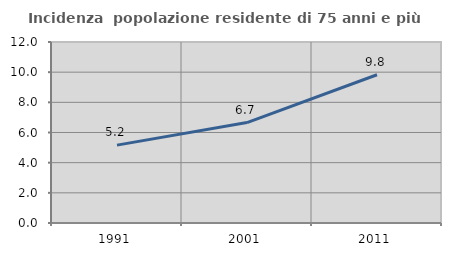
| Category | Incidenza  popolazione residente di 75 anni e più |
|---|---|
| 1991.0 | 5.162 |
| 2001.0 | 6.66 |
| 2011.0 | 9.83 |